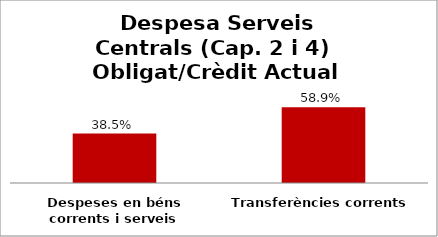
| Category | Series 0 |
|---|---|
| Despeses en béns corrents i serveis | 0.385 |
| Transferències corrents | 0.589 |